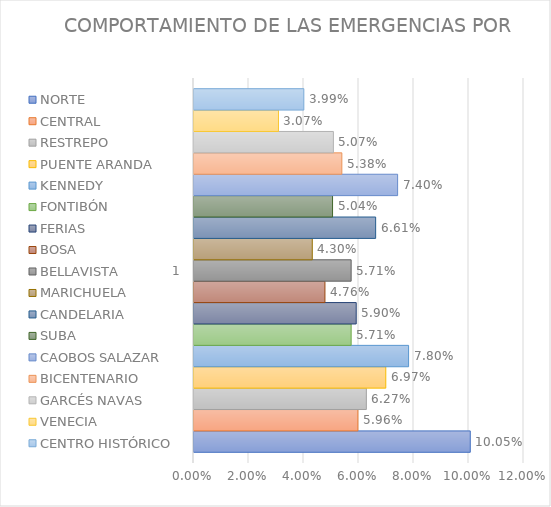
| Category | NORTE | CENTRAL | RESTREPO | PUENTE ARANDA | KENNEDY | FONTIBÓN | FERIAS | BOSA | BELLAVISTA | MARICHUELA | CANDELARIA | SUBA | CAOBOS SALAZAR | BICENTENARIO | GARCÉS NAVAS | VENECIA | CENTRO HISTÓRICO |
|---|---|---|---|---|---|---|---|---|---|---|---|---|---|---|---|---|---|
| 0 | 0.1 | 0.06 | 0.063 | 0.07 | 0.078 | 0.057 | 0.059 | 0.048 | 0.057 | 0.043 | 0.066 | 0.05 | 0.074 | 0.054 | 0.051 | 0.031 | 0.04 |